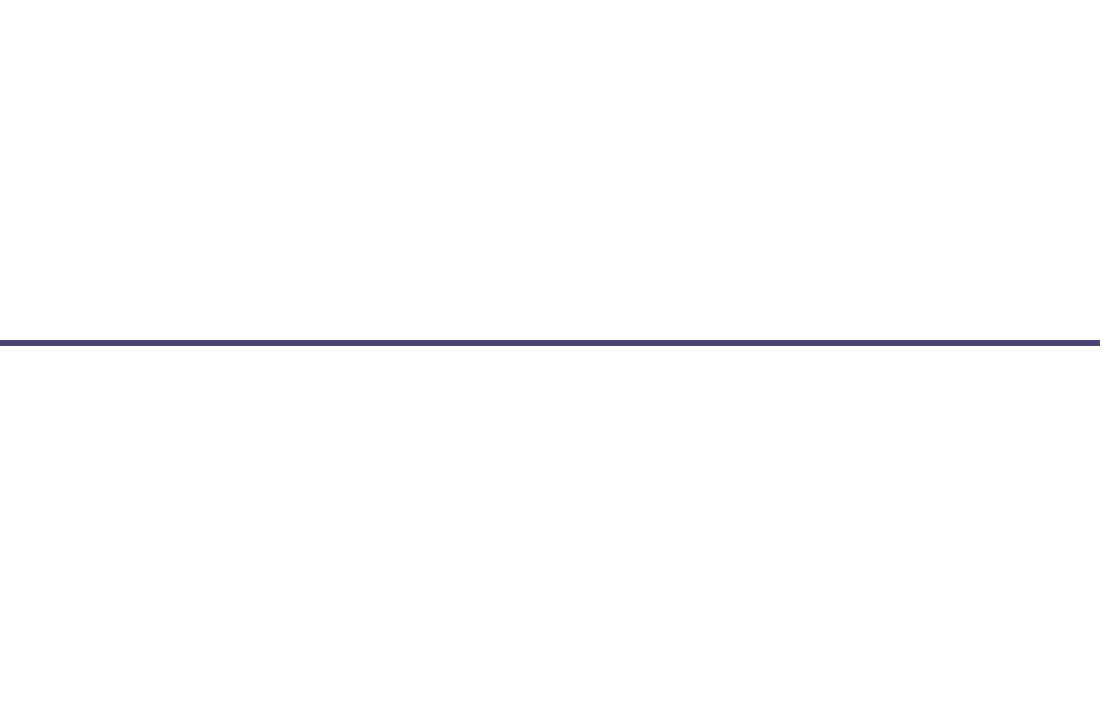
| Category | Položaj |
|---|---|
| 0 | 1 |
| 1 | -2 |
| 2 | 1 |
| 3 | -1 |
| 4 | -0.5 |
| 5 | 2 |
| 6 | 0.5 |
| 7 | -1 |
| 8 | 0.5 |
| 9 | -2 |